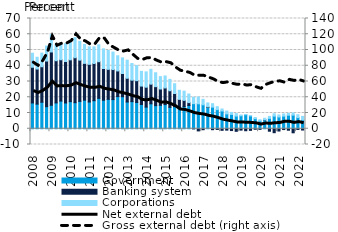
| Category | Government | Banking system | Corporations |
|---|---|---|---|
| 2008.0 | 16.378 | 22.68 | 8.902 |
| 2008.0 | 15.627 | 22.296 | 7.462 |
| 2008.0 | 16.821 | 22.539 | 8.666 |
| 2008.0 | 14.025 | 28.966 | 9.488 |
| 2009.0 | 14.904 | 33.852 | 11.021 |
| 2009.0 | 16.406 | 26.801 | 10.511 |
| 2009.0 | 17.572 | 26.242 | 10.344 |
| 2009.0 | 16.354 | 26.332 | 11.27 |
| 2010.0 | 17.21 | 26.553 | 11.112 |
| 2010.0 | 16.545 | 28.548 | 12.769 |
| 2010.0 | 17.367 | 26.204 | 11.923 |
| 2010.0 | 18.142 | 23.38 | 12.015 |
| 2011.0 | 16.979 | 23.927 | 11.103 |
| 2011.0 | 17.809 | 23.635 | 10.5 |
| 2011.0 | 19.313 | 23.248 | 10.733 |
| 2011.0 | 18.093 | 20.148 | 12.513 |
| 2012.0 | 18.676 | 19.05 | 11.963 |
| 2012.0 | 18.505 | 19.08 | 11.1 |
| 2012.0 | 20.425 | 16.28 | 9.649 |
| 2012.0 | 20.338 | 14.75 | 9.907 |
| 2013.0 | 16.969 | 15.092 | 11.467 |
| 2013.0 | 17.222 | 13.608 | 10.576 |
| 2013.0 | 16.686 | 13.849 | 9.571 |
| 2013.0 | 15.387 | 11.714 | 9.362 |
| 2014.0 | 13.727 | 12.651 | 9.733 |
| 2014.0 | 15.85 | 12.453 | 9.426 |
| 2014.0 | 14.671 | 12.06 | 8.821 |
| 2014.0 | 14.889 | 10.349 | 7.855 |
| 2015.0 | 15.339 | 10.557 | 7.609 |
| 2015.0 | 13.601 | 10.531 | 7.223 |
| 2015.0 | 14.046 | 8.342 | 6.193 |
| 2015.0 | 12.982 | 5.684 | 5.759 |
| 2016.0 | 14.039 | 3.974 | 5.856 |
| 2016.0 | 14.779 | 1.821 | 5.438 |
| 2016.0 | 15.951 | -0.067 | 4.047 |
| 2016.0 | 15.846 | -1.366 | 4.31 |
| 2017.0 | 15.212 | -0.62 | 3.468 |
| 2017.0 | 13.511 | 0.344 | 2.527 |
| 2017.0 | 13.733 | -0.604 | 2.171 |
| 2017.0 | 12.144 | -0.427 | 1.88 |
| 2018.0 | 11.29 | -0.999 | 1.253 |
| 2018.0 | 9.425 | -0.888 | 1.802 |
| 2018.0 | 9.117 | -1.151 | 1.258 |
| 2018.0 | 8.065 | -1.634 | 1.564 |
| 2019.0 | 8.235 | -0.872 | 0.514 |
| 2019.0 | 8.904 | -1.258 | 0.04 |
| 2019.0 | 8.148 | -1.017 | 0.269 |
| 2019.0 | 6.413 | -0.295 | 0.748 |
| 2020.0 | 5.013 | -0.372 | 0.689 |
| 2020.0 | 5.554 | 0.138 | 0.974 |
| 2020.0 | 6.613 | -1.569 | 1.215 |
| 2020.0 | 8.019 | -2.502 | 1.503 |
| 2021.0 | 7.474 | -1.442 | 1.295 |
| 2021.0 | 7.997 | -0.52 | 1.399 |
| 2021.0 | 8.599 | -0.94 | 1.167 |
| 2021.0 | 8.654 | -2.569 | 1.374 |
| 2022.0 | 7.096 | -0.448 | 1.807 |
| 2022.0 | 5.639 | -0.818 | 2.206 |